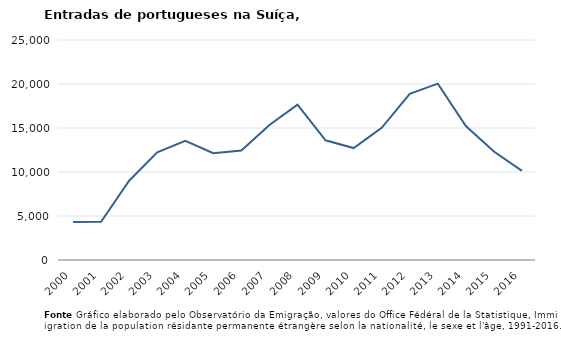
| Category | Entradas |
|---|---|
| 2000.0 | 4311 |
| 2001.0 | 4347 |
| 2002.0 | 9005 |
| 2003.0 | 12228 |
| 2004.0 | 13539 |
| 2005.0 | 12138 |
| 2006.0 | 12441 |
| 2007.0 | 15351 |
| 2008.0 | 17657 |
| 2009.0 | 13601 |
| 2010.0 | 12720 |
| 2011.0 | 15020 |
| 2012.0 | 18892 |
| 2013.0 | 20039 |
| 2014.0 | 15221 |
| 2015.0 | 12325 |
| 2016.0 | 10123 |